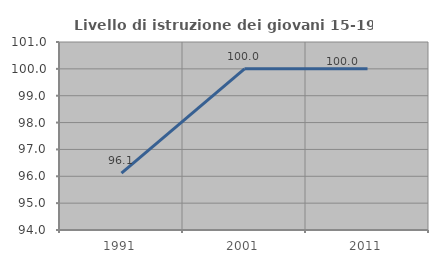
| Category | Livello di istruzione dei giovani 15-19 anni |
|---|---|
| 1991.0 | 96.117 |
| 2001.0 | 100 |
| 2011.0 | 100 |